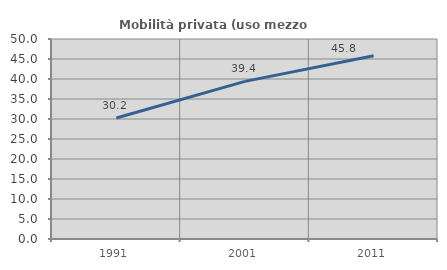
| Category | Mobilità privata (uso mezzo privato) |
|---|---|
| 1991.0 | 30.241 |
| 2001.0 | 39.411 |
| 2011.0 | 45.803 |